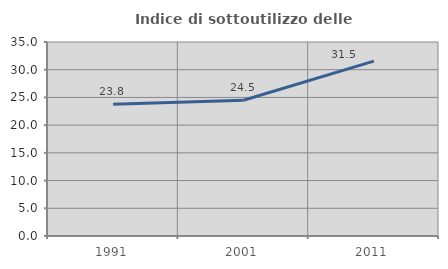
| Category | Indice di sottoutilizzo delle abitazioni  |
|---|---|
| 1991.0 | 23.789 |
| 2001.0 | 24.493 |
| 2011.0 | 31.543 |